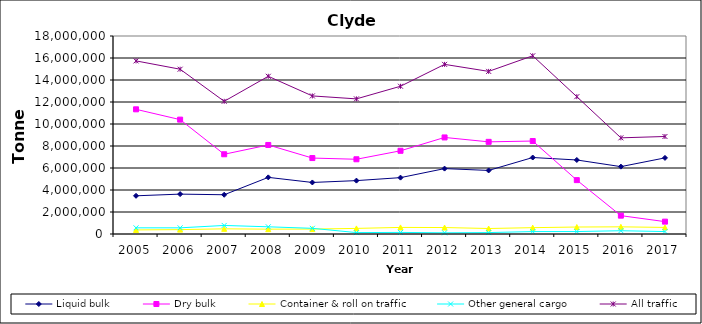
| Category | Liquid bulk | Dry bulk | Container & roll on traffic | Other general cargo | All traffic |
|---|---|---|---|---|---|
| 2005.0 | 3473000 | 11334000 | 370000 | 560000 | 15737000 |
| 2006.0 | 3626000 | 10397000 | 398000 | 560000 | 14981000 |
| 2007.0 | 3568000 | 7249000 | 469000 | 777000 | 12063000 |
| 2008.0 | 5149000 | 8095000 | 439000 | 654000 | 14338000 |
| 2009.0 | 4685485 | 6904211 | 446748 | 515680 | 12552124 |
| 2010.0 | 4853000 | 6793000 | 509000 | 128000 | 12283000 |
| 2011.0 | 5124000 | 7564000 | 599000 | 144000 | 13431000 |
| 2012.0 | 5945000 | 8778000 | 588000 | 109000 | 15421000 |
| 2013.0 | 5777000 | 8377000 | 499000 | 130000 | 14783000 |
| 2014.0 | 6952000 | 8451000 | 576000 | 221000 | 16201000 |
| 2015.0 | 6729000 | 4899000 | 634000 | 223000 | 12484000 |
| 2016.0 | 6125000 | 1668000 | 651000 | 298000 | 8742000 |
| 2017.0 | 6918000 | 1125000 | 599000 | 223000 | 8865000 |